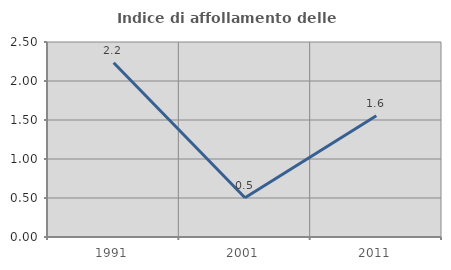
| Category | Indice di affollamento delle abitazioni  |
|---|---|
| 1991.0 | 2.235 |
| 2001.0 | 0.503 |
| 2011.0 | 1.554 |